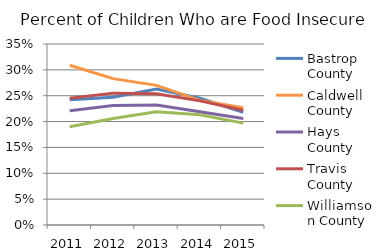
| Category | Bastrop County | Caldwell County | Hays County | Travis County | Williamson County |
|---|---|---|---|---|---|
| 2011.0 | 0.242 | 0.309 | 0.221 | 0.245 | 0.19 |
| 2012.0 | 0.247 | 0.283 | 0.231 | 0.255 | 0.206 |
| 2013.0 | 0.263 | 0.27 | 0.232 | 0.254 | 0.219 |
| 2014.0 | 0.245 | 0.241 | 0.219 | 0.24 | 0.213 |
| 2015.0 | 0.218 | 0.227 | 0.206 | 0.222 | 0.197 |